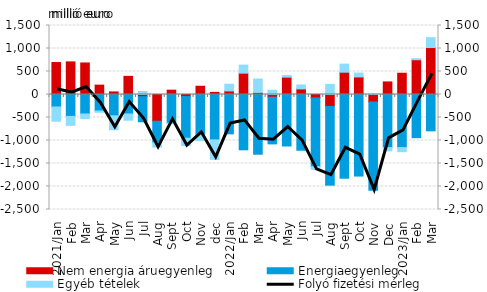
| Category | Nem energia áruegyenleg | Energiaegyenleg | Egyéb tételek |
|---|---|---|---|
| 2021.jan | 695.038 | -270.909 | -310.128 |
| febr | 709.099 | -475.704 | -195.183 |
| márc | 685.674 | -423.565 | -99.249 |
| ápr | 203.564 | -358.231 | -28.668 |
| máj | 56.081 | -462.948 | -303.172 |
| jún | 394.68 | -422.909 | -136.479 |
| júl | -46.84 | -546.536 | 65.791 |
| aug | -580.85 | -466.959 | -95.859 |
| szept | 94.203 | -622.36 | -11.273 |
| okt | -44.297 | -905.592 | -160.008 |
| nov | 179.293 | -875.351 | -127.088 |
| dec | 46.143 | -986.524 | -425.078 |
| 2022.jan | 77.509 | -855.658 | 146.284 |
| febr | 464.094 | -1202.104 | 174.741 |
| márc | 45.422 | -1298.214 | 291.034 |
| ápr | -58.268 | -1015.443 | 92.537 |
| máj | 377.575 | -1119.512 | 34.903 |
| jún | 121.504 | -1211.956 | 86.206 |
| júl | -74.332 | -1495.218 | -58.729 |
| aug | -259.127 | -1711.952 | 219.996 |
| szept | 484.443 | -1820.019 | 176.144 |
| okt | 381.809 | -1773.099 | 84.228 |
| nov | -164.869 | -1918.58 | 6.96 |
| dec | 273.392 | -1153.364 | -72.646 |
| 2023.jan | 462.144 | -1153.535 | -89.317 |
| febr | 755.214 | -938.153 | 22.597 |
| márc | 1020.458 | -789.739 | 215.228 |